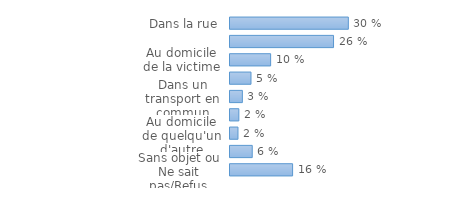
| Category | Series 0 |
|---|---|
| Dans la rue | 0.298 |
| Sur le lieu de travail ou d'études  | 0.26 |
| Au domicile de la victime | 0.102 |
| Dans l'immeuble de la victime | 0.053 |
| Dans un transport en commun | 0.031 |
| Dans un établissement commercial | 0.022 |
| Au domicile de quelqu'un d'autre | 0.02 |
| Dans un autre lieu | 0.056 |
| Sans objet ou Ne sait pas/Refus | 0.157 |